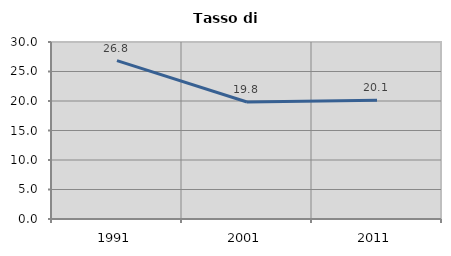
| Category | Tasso di disoccupazione   |
|---|---|
| 1991.0 | 26.84 |
| 2001.0 | 19.832 |
| 2011.0 | 20.119 |